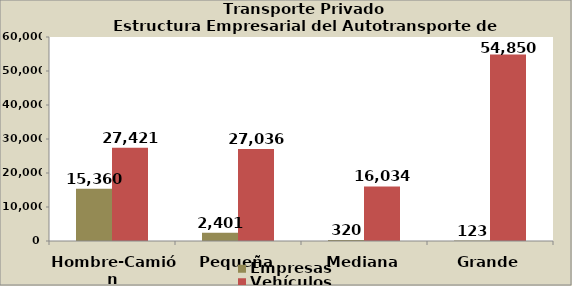
| Category | Empresas | Vehículos |
|---|---|---|
| Hombre-Camión | 15360 | 27421 |
| Pequeña | 2401 | 27036 |
| Mediana | 320 | 16034 |
| Grande | 123 | 54850 |